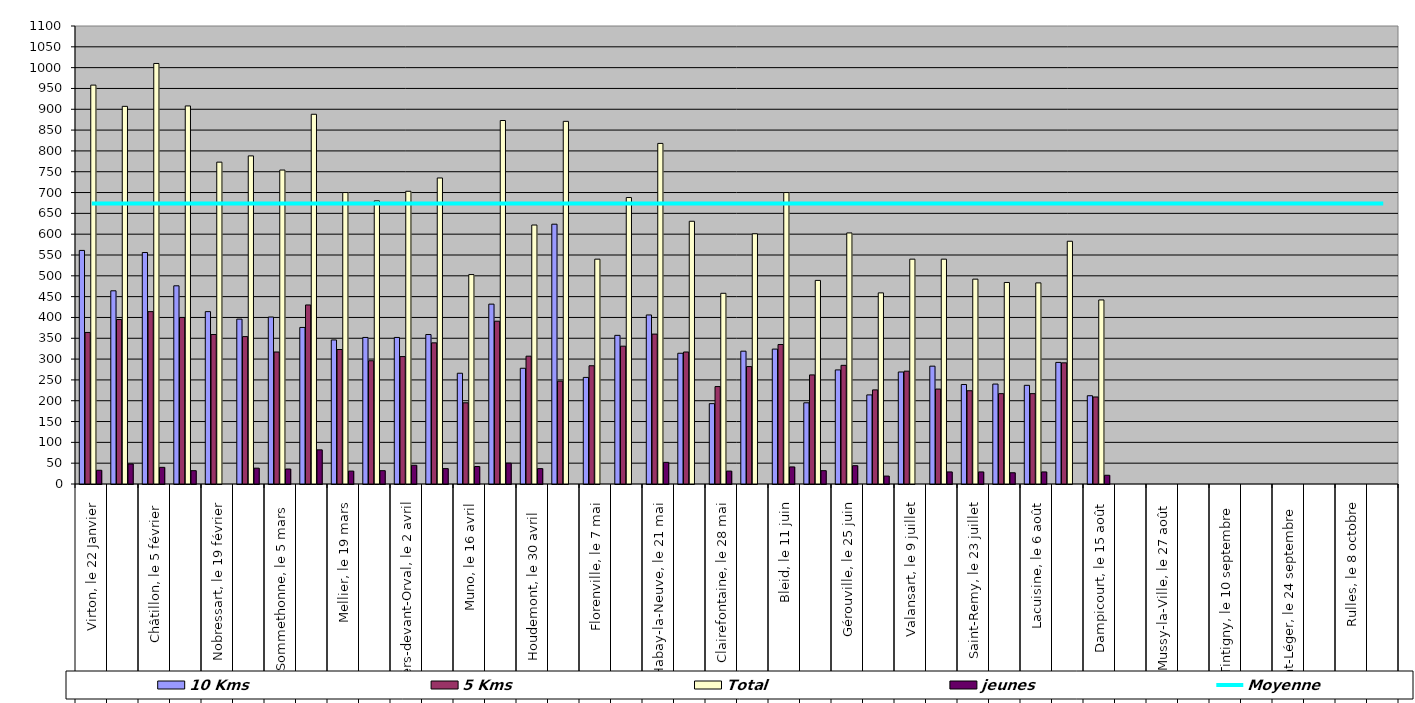
| Category | 10 Kms | 5 Kms | Total | jeunes |
|---|---|---|---|---|
| 0 | 561 | 364 | 958 | 33 |
| 1 | 464 | 395 | 907 | 48 |
| 2 | 556 | 414 | 1010 | 40 |
| 3 | 476 | 400 | 908 | 32 |
| 4 | 414 | 359 | 773 | 0 |
| 5 | 396 | 354 | 788 | 38 |
| 6 | 401 | 317 | 754 | 36 |
| 7 | 376 | 430 | 888 | 82 |
| 8 | 346 | 323 | 700 | 31 |
| 9 | 352 | 296 | 680 | 32 |
| 10 | 352 | 306 | 703 | 45 |
| 11 | 359 | 339 | 735 | 37 |
| 12 | 266 | 195 | 503 | 42 |
| 13 | 432 | 391 | 873 | 50 |
| 14 | 278 | 307 | 622 | 37 |
| 15 | 624 | 247 | 871 | 0 |
| 16 | 256 | 284 | 540 | 0 |
| 17 | 357 | 331 | 688 | 0 |
| 18 | 406 | 360 | 818 | 52 |
| 19 | 314 | 317 | 631 | 0 |
| 20 | 193 | 234 | 458 | 31 |
| 21 | 319 | 282 | 601 | 0 |
| 22 | 324 | 335 | 700 | 41 |
| 23 | 195 | 262 | 489 | 32 |
| 24 | 274 | 285 | 603 | 44 |
| 25 | 214 | 226 | 459 | 19 |
| 26 | 269 | 271 | 540 | 0 |
| 27 | 283 | 228 | 540 | 29 |
| 28 | 239 | 224 | 492 | 29 |
| 29 | 240 | 217 | 484 | 27 |
| 30 | 237 | 217 | 483 | 29 |
| 31 | 292 | 291 | 583 | 0 |
| 32 | 212 | 209 | 442 | 21 |
| 33 | 0 | 0 | 0 | 0 |
| 34 | 0 | 0 | 0 | 0 |
| 35 | 0 | 0 | 0 | 0 |
| 36 | 0 | 0 | 0 | 0 |
| 37 | 0 | 0 | 0 | 0 |
| 38 | 0 | 0 | 0 | 0 |
| 39 | 0 | 0 | 0 | 0 |
| 40 | 0 | 0 | 0 | 0 |
| 41 | 0 | 0 | 0 | 0 |